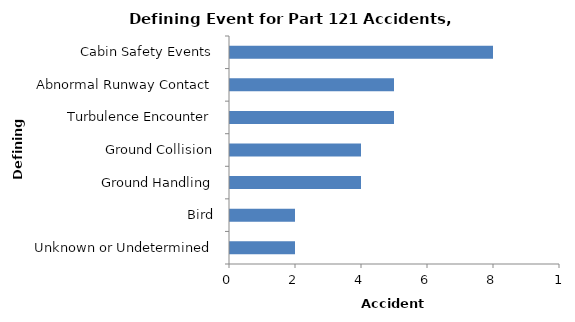
| Category | Accident Aircraft |
|---|---|
| Cabin Safety Events | 8 |
| Abnormal Runway Contact | 5 |
| Turbulence Encounter | 5 |
| Ground Collision | 4 |
| Ground Handling | 4 |
| Bird | 2 |
| Unknown or Undetermined | 2 |